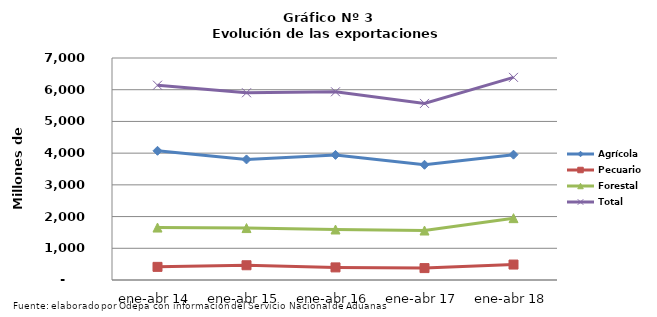
| Category | Agrícola | Pecuario | Forestal | Total |
|---|---|---|---|---|
| ene-abr 14 | 4074303 | 414037 | 1653823 | 6142163 |
| ene-abr 15 | 3801593 | 465060 | 1637267 | 5903920 |
| ene-abr 16 | 3944973 | 397399 | 1592049 | 5934421 |
| ene-abr 17 | 3633553 | 375185 | 1559907 | 5568645 |
| ene-abr 18 | 3952081 | 487163 | 1950412 | 6389656 |